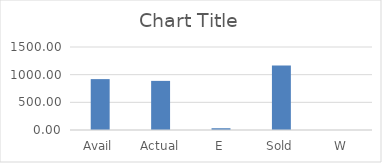
| Category | Series 0 |
|---|---|
| Avail | 919.65 |
| Actual | 887.65 |
| E | 31.96 |
| Sold | 1165.65 |
| W | 0 |